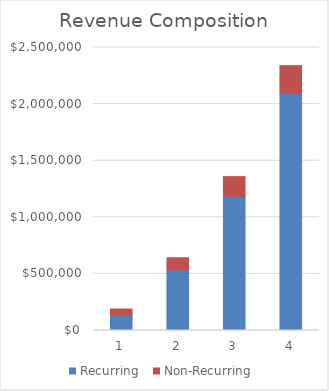
| Category | Recurring | Non-Recurring |
|---|---|---|
| 1.0 | 138802.083 | 51093.75 |
| 2.0 | 533854.167 | 108906.25 |
| 3.0 | 1185156.25 | 174218.75 |
| 4.0 | 2092708.333 | 247031.25 |